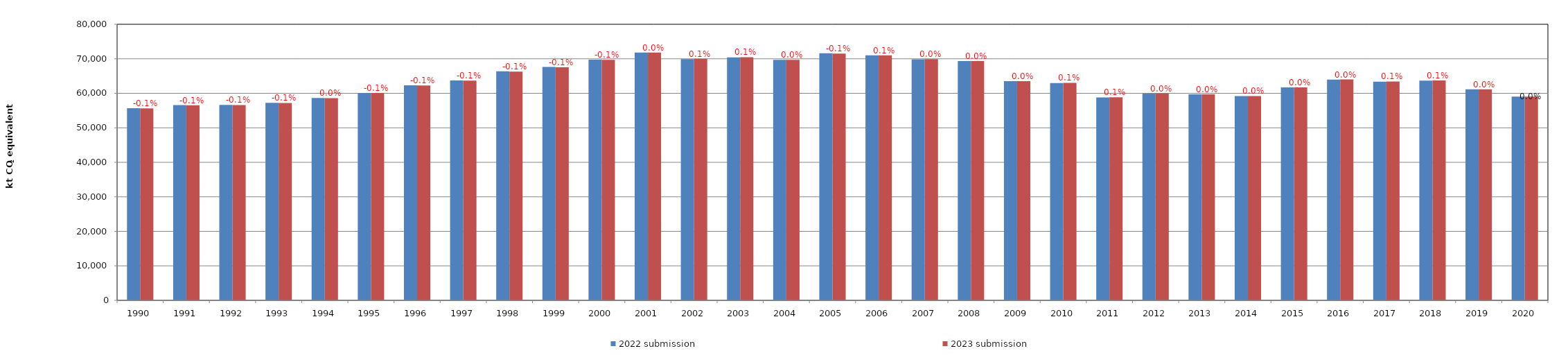
| Category | 2022 submission | 2023 submission |
|---|---|---|
| 1990.0 | 55677.178 | 55642.836 |
| 1991.0 | 56592.359 | 56553.463 |
| 1992.0 | 56630.019 | 56589.558 |
| 1993.0 | 57224.994 | 57186.826 |
| 1994.0 | 58619.766 | 58593.624 |
| 1995.0 | 60118.856 | 60080.658 |
| 1996.0 | 62317.145 | 62245.168 |
| 1997.0 | 63739.361 | 63683.616 |
| 1998.0 | 66391.556 | 66292.456 |
| 1999.0 | 67617.311 | 67523.409 |
| 2000.0 | 69769.589 | 69712.382 |
| 2001.0 | 71825.393 | 71814.454 |
| 2002.0 | 69904.819 | 69975.2 |
| 2003.0 | 70388.667 | 70468.497 |
| 2004.0 | 69717.05 | 69723.023 |
| 2005.0 | 71592.859 | 71531.479 |
| 2006.0 | 70980.294 | 71019.463 |
| 2007.0 | 69845.046 | 69874.867 |
| 2008.0 | 69327.701 | 69330.435 |
| 2009.0 | 63499.683 | 63528.259 |
| 2010.0 | 62952.749 | 63032.162 |
| 2011.0 | 58798.908 | 58852.526 |
| 2012.0 | 59914.104 | 59939.507 |
| 2013.0 | 59701.414 | 59711.607 |
| 2014.0 | 59219.317 | 59220.742 |
| 2015.0 | 61724.084 | 61724.028 |
| 2016.0 | 63984.097 | 64005.357 |
| 2017.0 | 63373.064 | 63424.535 |
| 2018.0 | 63654.568 | 63734.108 |
| 2019.0 | 61151.116 | 61165.039 |
| 2020.0 | 59052.571 | 59056.301 |